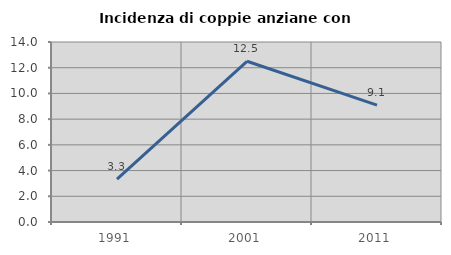
| Category | Incidenza di coppie anziane con figli |
|---|---|
| 1991.0 | 3.333 |
| 2001.0 | 12.5 |
| 2011.0 | 9.091 |